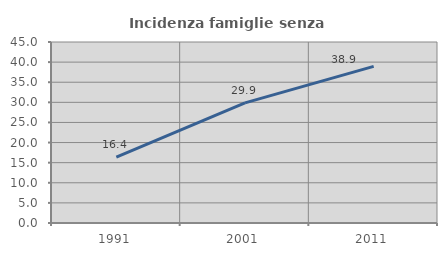
| Category | Incidenza famiglie senza nuclei |
|---|---|
| 1991.0 | 16.377 |
| 2001.0 | 29.871 |
| 2011.0 | 38.927 |